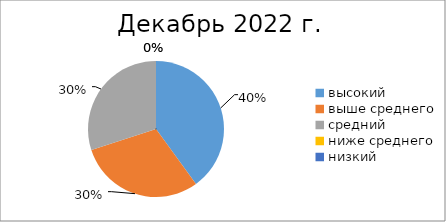
| Category | Series 0 |
|---|---|
| высокий | 4 |
| выше среднего | 3 |
| средний | 3 |
| ниже среднего | 0 |
| низкий | 0 |